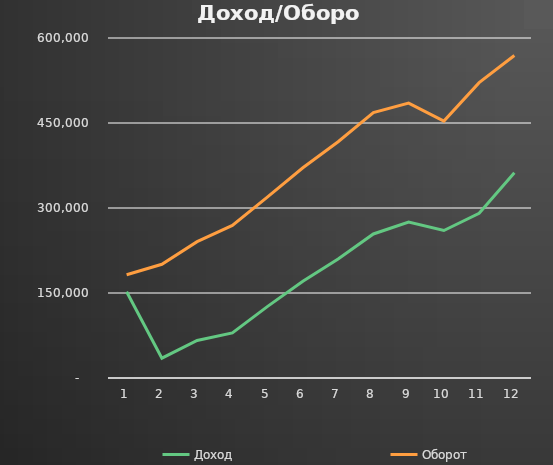
| Category | Доход | Оборот |
|---|---|---|
| 0 | 152250 | 182250 |
| 1 | 34991.525 | 200639.025 |
| 2 | 66310.416 | 240566.191 |
| 3 | 79686.25 | 269209.605 |
| 4 | 126372.008 | 319708.2 |
| 5 | 170749.554 | 370941.439 |
| 6 | 210022.121 | 416981.817 |
| 7 | 254181.249 | 468353.977 |
| 8 | 275029.156 | 485214.72 |
| 9 | 260336.918 | 453479.055 |
| 10 | 290712.216 | 521262.24 |
| 11 | 362091.059 | 569218.366 |